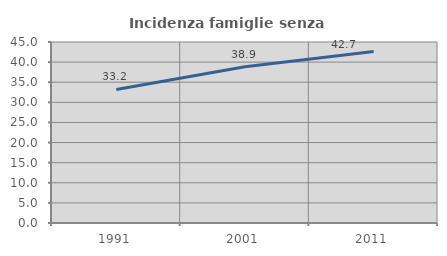
| Category | Incidenza famiglie senza nuclei |
|---|---|
| 1991.0 | 33.203 |
| 2001.0 | 38.869 |
| 2011.0 | 42.662 |